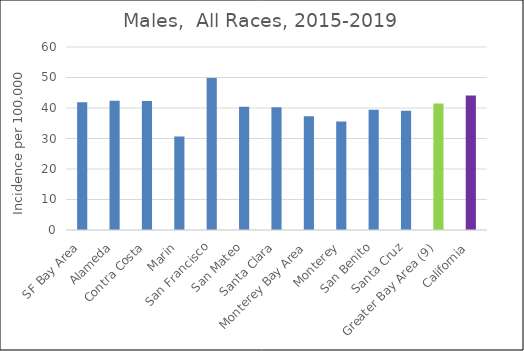
| Category | Male |
|---|---|
| SF Bay Area | 41.9 |
|   Alameda | 42.37 |
|   Contra Costa | 42.3 |
|   Marin | 30.62 |
|   San Francisco | 49.81 |
|   San Mateo | 40.4 |
|   Santa Clara | 40.28 |
| Monterey Bay Area | 37.3 |
|   Monterey | 35.54 |
|   San Benito | 39.46 |
|   Santa Cruz | 39.08 |
| Greater Bay Area (9) | 41.44 |
| California | 44.11 |